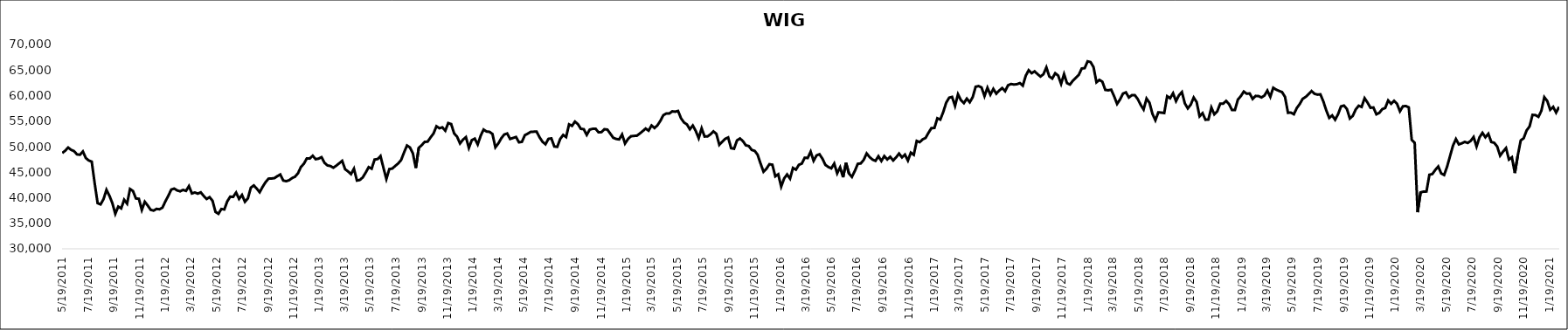
| Category | WIG |
|---|---|
| 5/19/11 | 48747.55 |
| 5/26/11 | 49215.53 |
| 6/2/11 | 49824.93 |
| 6/9/11 | 49378.82 |
| 6/16/11 | 49129.21 |
| 6/23/11 | 48485.26 |
| 6/30/11 | 48414.36 |
| 7/7/11 | 49057.05 |
| 7/14/11 | 47768.38 |
| 7/21/11 | 47291.31 |
| 7/28/11 | 47071.4 |
| 8/4/11 | 42828.22 |
| 8/11/11 | 38934.71 |
| 8/18/11 | 38697.56 |
| 8/25/11 | 39715.27 |
| 9/1/11 | 41553.09 |
| 9/8/11 | 40405.17 |
| 9/15/11 | 38945 |
| 9/22/11 | 36851.2 |
| 9/29/11 | 38264.32 |
| 10/6/11 | 37915.03 |
| 10/13/11 | 39608.13 |
| 10/20/11 | 38835.92 |
| 10/27/11 | 41708.88 |
| 11/3/11 | 41313.92 |
| 11/10/11 | 39853.18 |
| 11/17/11 | 39797.19 |
| 11/24/11 | 37607.27 |
| 12/1/11 | 39215.21 |
| 12/8/11 | 38474.28 |
| 12/15/11 | 37637.47 |
| 12/22/11 | 37478.7 |
| 12/29/11 | 37814.52 |
| 1/5/12 | 37739.39 |
| 1/12/12 | 38062.87 |
| 1/19/12 | 39288.13 |
| 1/26/12 | 40392.48 |
| 2/2/12 | 41602.24 |
| 2/9/12 | 41792.46 |
| 2/16/12 | 41430.3 |
| 2/23/12 | 41258.14 |
| 3/1/12 | 41533.87 |
| 3/8/12 | 41337.97 |
| 3/15/12 | 42281.33 |
| 3/22/12 | 40834.43 |
| 3/29/12 | 41028.06 |
| 4/5/12 | 40802.41 |
| 4/12/12 | 41053.82 |
| 4/19/12 | 40354.53 |
| 4/26/12 | 39761.78 |
| 5/3/12 | 40114.73 |
| 5/10/12 | 39404.16 |
| 5/17/12 | 37228.88 |
| 5/24/12 | 36852.75 |
| 5/31/12 | 37793.58 |
| 6/7/12 | 37707.25 |
| 6/14/12 | 39286.64 |
| 6/21/12 | 40207.61 |
| 6/28/12 | 40165.34 |
| 7/5/12 | 41013.96 |
| 7/12/12 | 39778.1 |
| 7/19/12 | 40545.64 |
| 7/26/12 | 39213.05 |
| 8/2/12 | 39876.95 |
| 8/9/12 | 41976.63 |
| 8/16/12 | 42408.41 |
| 8/23/12 | 41795.63 |
| 8/30/12 | 41077.44 |
| 9/6/12 | 42134.93 |
| 9/13/12 | 43047.41 |
| 9/20/12 | 43737.02 |
| 9/27/12 | 43763.3 |
| 10/4/12 | 43840.23 |
| 10/11/12 | 44224.67 |
| 10/18/12 | 44550.12 |
| 10/25/12 | 43374.6 |
| 11/1/12 | 43232.44 |
| 11/8/12 | 43429.42 |
| 11/15/12 | 43845.94 |
| 11/22/12 | 44121.53 |
| 11/29/12 | 44787.84 |
| 12/6/12 | 46019.97 |
| 12/13/12 | 46653.84 |
| 12/20/12 | 47701.82 |
| 12/27/12 | 47673.03 |
| 1/3/13 | 48222.72 |
| 1/10/13 | 47546.91 |
| 1/17/13 | 47661.37 |
| 1/24/13 | 47942.04 |
| 1/31/13 | 46840.15 |
| 2/7/13 | 46329.66 |
| 2/14/13 | 46211.54 |
| 2/21/13 | 45879.9 |
| 2/28/13 | 46280.36 |
| 3/7/13 | 46745.26 |
| 3/14/13 | 47223.68 |
| 3/21/13 | 45580.47 |
| 3/28/13 | 45147.57 |
| 4/4/13 | 44623.89 |
| 4/11/13 | 45688.48 |
| 4/18/13 | 43364.7 |
| 4/25/13 | 43482.18 |
| 5/2/13 | 43991.51 |
| 5/9/13 | 44943.16 |
| 5/16/13 | 45992.03 |
| 5/23/13 | 45687.76 |
| 5/30/13 | 47476.64 |
| 6/6/13 | 47573.66 |
| 6/13/13 | 48152.82 |
| 6/20/13 | 45870 |
| 6/27/13 | 43667.37 |
| 7/4/13 | 45613.75 |
| 7/11/13 | 45712.72 |
| 7/18/13 | 46221.23 |
| 7/25/13 | 46713.02 |
| 8/1/13 | 47370.81 |
| 8/8/13 | 48862.88 |
| 8/15/13 | 50223.95 |
| 8/22/13 | 49846.48 |
| 8/29/13 | 48676.45 |
| 9/5/13 | 45830.66 |
| 9/12/13 | 49771.55 |
| 9/19/13 | 50300.53 |
| 9/26/13 | 50936.34 |
| 10/3/13 | 50982.03 |
| 10/10/13 | 51806.83 |
| 10/17/13 | 52573.59 |
| 10/24/13 | 53994.46 |
| 10/31/13 | 53607.86 |
| 11/7/13 | 53785.07 |
| 11/14/13 | 53127.16 |
| 11/21/13 | 54621.21 |
| 11/28/13 | 54420.19 |
| 12/5/13 | 52597.13 |
| 12/12/13 | 51947.96 |
| 12/19/13 | 50631.75 |
| 12/26/13 | 51362.3 |
| 1/2/14 | 51865.89 |
| 1/9/14 | 49753.03 |
| 1/16/14 | 51288.7 |
| 1/23/14 | 51569.21 |
| 1/30/14 | 50417.17 |
| 2/6/14 | 52138.87 |
| 2/13/14 | 53349.65 |
| 2/20/14 | 52967.02 |
| 2/27/14 | 52906.04 |
| 3/6/14 | 52487.84 |
| 3/13/14 | 49878.65 |
| 3/20/14 | 50627.71 |
| 3/27/14 | 51642.99 |
| 4/3/14 | 52376.18 |
| 4/10/14 | 52580.73 |
| 4/17/14 | 51510.98 |
| 4/24/14 | 51705.76 |
| 5/1/14 | 51892.77 |
| 5/8/14 | 50851.25 |
| 5/15/14 | 50944.5 |
| 5/22/14 | 52244.13 |
| 5/29/14 | 52553.48 |
| 6/5/14 | 52901.29 |
| 6/12/14 | 52927.91 |
| 6/19/14 | 52937.45 |
| 6/26/14 | 51815.43 |
| 7/3/14 | 50951.73 |
| 7/10/14 | 50474.36 |
| 7/17/14 | 51527.37 |
| 7/24/14 | 51613.47 |
| 7/31/14 | 50037.12 |
| 8/7/14 | 49958.67 |
| 8/14/14 | 51512.57 |
| 8/21/14 | 52294.93 |
| 8/28/14 | 51882.01 |
| 9/4/14 | 54358.49 |
| 9/11/14 | 54065.27 |
| 9/18/14 | 54906.1 |
| 9/25/14 | 54411.77 |
| 10/2/14 | 53498.77 |
| 10/9/14 | 53416.03 |
| 10/16/14 | 52297.79 |
| 10/23/14 | 53335.43 |
| 10/30/14 | 53492 |
| 11/6/14 | 53512.14 |
| 11/13/14 | 52816.35 |
| 11/20/14 | 52848.54 |
| 11/27/14 | 53415.63 |
| 12/4/14 | 53346.86 |
| 12/11/14 | 52550.03 |
| 12/18/14 | 51739.04 |
| 12/25/14 | 51511.68 |
| 1/1/15 | 51416.08 |
| 1/8/15 | 52391 |
| 1/15/15 | 50616.63 |
| 1/22/15 | 51484.81 |
| 1/29/15 | 52040.24 |
| 2/5/15 | 52107.26 |
| 2/12/15 | 52139.81 |
| 2/19/15 | 52572.95 |
| 2/26/15 | 53042.6 |
| 3/5/15 | 53546.4 |
| 3/12/15 | 53136.13 |
| 3/19/15 | 54148.48 |
| 3/26/15 | 53649.9 |
| 4/2/15 | 54179.04 |
| 4/9/15 | 55063.85 |
| 4/16/15 | 56165.1 |
| 4/23/15 | 56492.95 |
| 4/30/15 | 56477.69 |
| 5/7/15 | 56911.34 |
| 5/14/15 | 56845.83 |
| 5/21/15 | 56990.6 |
| 5/28/15 | 55556.13 |
| 6/4/15 | 54749.74 |
| 6/11/15 | 54357.69 |
| 6/18/15 | 53408.53 |
| 6/25/15 | 54141.2 |
| 7/2/15 | 53074.71 |
| 7/9/15 | 51658.71 |
| 7/16/15 | 53588.24 |
| 7/23/15 | 51986.22 |
| 7/30/15 | 52011.81 |
| 8/6/15 | 52418.07 |
| 8/13/15 | 52995.96 |
| 8/20/15 | 52508.32 |
| 8/27/15 | 50366.09 |
| 9/3/15 | 50977.06 |
| 9/10/15 | 51527.08 |
| 9/17/15 | 51801.58 |
| 9/24/15 | 49701.31 |
| 10/1/15 | 49593.95 |
| 10/8/15 | 51222.77 |
| 10/15/15 | 51599.62 |
| 10/22/15 | 51094.29 |
| 10/29/15 | 50262.68 |
| 11/5/15 | 50125.85 |
| 11/12/15 | 49358.2 |
| 11/19/15 | 49177.74 |
| 11/26/15 | 48418.14 |
| 12/3/15 | 46693.09 |
| 12/10/15 | 45093.65 |
| 12/17/15 | 45684.05 |
| 12/24/15 | 46564.08 |
| 12/31/15 | 46467.38 |
| 1/7/16 | 44195.91 |
| 1/14/16 | 44596.08 |
| 1/21/16 | 42180.3 |
| 1/28/16 | 43778.96 |
| 2/4/16 | 44557.64 |
| 2/11/16 | 43741.96 |
| 2/18/16 | 45834.88 |
| 2/25/16 | 45497.77 |
| 3/3/16 | 46448.27 |
| 3/10/16 | 46686.74 |
| 3/17/16 | 47833.39 |
| 3/24/16 | 47778.01 |
| 3/31/16 | 49017.35 |
| 4/7/16 | 47231.36 |
| 4/14/16 | 48285.21 |
| 4/21/16 | 48514.39 |
| 4/28/16 | 47643.7 |
| 5/5/16 | 46430.16 |
| 5/12/16 | 46022.02 |
| 5/19/16 | 45751.68 |
| 5/26/16 | 46695.37 |
| 6/2/16 | 44772.72 |
| 6/9/16 | 45940.12 |
| 6/16/16 | 44007.81 |
| 6/23/16 | 46826.85 |
| 6/30/16 | 44748.53 |
| 7/7/16 | 44077.16 |
| 7/14/16 | 45246.26 |
| 7/21/16 | 46639.17 |
| 7/28/16 | 46718.98 |
| 8/4/16 | 47407.09 |
| 8/11/16 | 48675.96 |
| 8/18/16 | 47967.07 |
| 8/25/16 | 47464.07 |
| 9/1/16 | 47221.32 |
| 9/8/16 | 48129.15 |
| 9/15/16 | 47198.39 |
| 9/22/16 | 48154.88 |
| 9/29/16 | 47494.62 |
| 10/6/16 | 48014.44 |
| 10/13/16 | 47303.15 |
| 10/20/16 | 47894.17 |
| 10/27/16 | 48651.28 |
| 11/3/16 | 47899.61 |
| 11/10/16 | 48447.59 |
| 11/17/16 | 47274.21 |
| 11/24/16 | 48824.83 |
| 12/1/16 | 48404.21 |
| 12/8/16 | 51123.43 |
| 12/15/16 | 50881.35 |
| 12/22/16 | 51423.71 |
| 12/29/16 | 51703.91 |
| 1/5/17 | 52721.67 |
| 1/12/17 | 53650.94 |
| 1/19/17 | 53654.99 |
| 1/26/17 | 55560.23 |
| 2/2/17 | 55303.11 |
| 2/9/17 | 56785.52 |
| 2/16/17 | 58610.28 |
| 2/23/17 | 59583.89 |
| 3/2/17 | 59743.64 |
| 3/9/17 | 57986.6 |
| 3/16/17 | 60247.18 |
| 3/23/17 | 59093.68 |
| 3/30/17 | 58527.2 |
| 4/6/17 | 59406.36 |
| 4/13/17 | 58695.36 |
| 4/20/17 | 59700.07 |
| 4/27/17 | 61731.8 |
| 5/4/17 | 61862.8 |
| 5/11/17 | 61598.78 |
| 5/18/17 | 59901.12 |
| 5/25/17 | 61536.22 |
| 6/1/17 | 60181.96 |
| 6/8/17 | 61312.68 |
| 6/15/17 | 60381.07 |
| 6/22/17 | 60987.33 |
| 6/29/17 | 61475.96 |
| 7/6/17 | 60869.83 |
| 7/13/17 | 62018.68 |
| 7/20/17 | 62269.72 |
| 7/27/17 | 62171.7 |
| 8/3/17 | 62231.08 |
| 8/10/17 | 62451.57 |
| 8/17/17 | 61949.4 |
| 8/24/17 | 63886.54 |
| 8/31/17 | 64973.76 |
| 9/7/17 | 64381.87 |
| 9/14/17 | 64748.47 |
| 9/21/17 | 64209.19 |
| 9/28/17 | 63729.77 |
| 10/5/17 | 64185.71 |
| 10/12/17 | 65529.1 |
| 10/19/17 | 63745 |
| 10/26/17 | 63342.71 |
| 11/2/17 | 64375.83 |
| 11/9/17 | 63923.62 |
| 11/16/17 | 62299.29 |
| 11/23/17 | 64207.77 |
| 11/30/17 | 62440.31 |
| 12/7/17 | 62164.65 |
| 12/14/17 | 62916.39 |
| 12/21/17 | 63477.25 |
| 12/28/17 | 64053.47 |
| 1/4/18 | 65297.96 |
| 1/11/18 | 65379.88 |
| 1/18/18 | 66709.12 |
| 1/25/18 | 66561.79 |
| 2/1/18 | 65585.79 |
| 2/8/18 | 62604.89 |
| 2/15/18 | 63078.16 |
| 2/22/18 | 62717.27 |
| 3/1/18 | 61116.96 |
| 3/8/18 | 61036.99 |
| 3/15/18 | 61156.91 |
| 3/22/18 | 59862.55 |
| 3/29/18 | 58377.42 |
| 4/5/18 | 59244.04 |
| 4/12/18 | 60393.23 |
| 4/19/18 | 60629.81 |
| 4/26/18 | 59628.04 |
| 5/3/18 | 60066.46 |
| 5/10/18 | 60091.26 |
| 5/17/18 | 59337.27 |
| 5/24/18 | 58189.49 |
| 5/31/18 | 57282.73 |
| 6/7/18 | 59412.76 |
| 6/14/18 | 58603.93 |
| 6/21/18 | 56425.25 |
| 6/28/18 | 55169.77 |
| 7/5/18 | 56719.88 |
| 7/12/18 | 56671.44 |
| 7/19/18 | 56585.5 |
| 7/26/18 | 59871.2 |
| 8/2/18 | 59484.35 |
| 8/9/18 | 60455.75 |
| 8/16/18 | 58921.44 |
| 8/23/18 | 60044.45 |
| 8/30/18 | 60690.32 |
| 9/6/18 | 58469.6 |
| 9/13/18 | 57493.38 |
| 9/20/18 | 58231.57 |
| 9/27/18 | 59616.27 |
| 10/4/18 | 58736.08 |
| 10/11/18 | 55941.06 |
| 10/18/18 | 56560.93 |
| 10/25/18 | 55271.63 |
| 11/1/18 | 55312.71 |
| 11/8/18 | 57655.73 |
| 11/15/18 | 56329.01 |
| 11/22/18 | 56932.62 |
| 11/29/18 | 58412.94 |
| 12/6/18 | 58409.09 |
| 12/13/18 | 58952.55 |
| 12/20/18 | 58349.03 |
| 12/27/18 | 57183.28 |
| 1/3/19 | 57192.42 |
| 1/10/19 | 59219.23 |
| 1/17/19 | 59894.9 |
| 1/24/19 | 60791.02 |
| 1/31/19 | 60367.42 |
| 2/7/19 | 60422.38 |
| 2/14/19 | 59348.4 |
| 2/21/19 | 59938.07 |
| 2/28/19 | 59903.7 |
| 3/7/19 | 59638.3 |
| 3/14/19 | 60002.72 |
| 3/21/19 | 60976.51 |
| 3/28/19 | 59752.66 |
| 4/4/19 | 61533.27 |
| 4/11/19 | 61168.92 |
| 4/18/19 | 60910.11 |
| 4/25/19 | 60680.62 |
| 5/2/19 | 59744.3 |
| 5/9/19 | 56637.25 |
| 5/16/19 | 56664.5 |
| 5/23/19 | 56351.13 |
| 5/30/19 | 57566.83 |
| 6/6/19 | 58360.5 |
| 6/13/19 | 59374.38 |
| 6/20/19 | 59738.56 |
| 6/27/19 | 60293.37 |
| 7/4/19 | 60888.98 |
| 7/11/19 | 60362.11 |
| 7/18/19 | 60192.6 |
| 7/25/19 | 60249.72 |
| 8/1/19 | 58863.73 |
| 8/8/19 | 57102.69 |
| 8/15/19 | 55634.7 |
| 8/22/19 | 56118.92 |
| 8/29/19 | 55273.05 |
| 9/5/19 | 56358.3 |
| 9/12/19 | 57886.6 |
| 9/19/19 | 58053.03 |
| 9/26/19 | 57377.87 |
| 10/3/19 | 55523.06 |
| 10/10/19 | 56034.97 |
| 10/17/19 | 57297.12 |
| 10/24/19 | 58012.97 |
| 10/31/19 | 57783.02 |
| 11/7/19 | 59492.22 |
| 11/14/19 | 58622.1 |
| 11/21/19 | 57618.54 |
| 11/28/19 | 57669.94 |
| 12/5/19 | 56338.75 |
| 12/12/19 | 56621.06 |
| 12/19/19 | 57346.95 |
| 12/26/19 | 57569.71 |
| 1/2/20 | 59048.28 |
| 1/9/20 | 58397.17 |
| 1/16/20 | 58962.37 |
| 1/23/20 | 58401.85 |
| 1/30/20 | 56923.36 |
| 2/6/20 | 57900.04 |
| 2/13/20 | 57960.23 |
| 2/20/20 | 57693.12 |
| 2/27/20 | 51318.69 |
| 3/5/20 | 50753.91 |
| 3/12/20 | 37164.02 |
| 3/19/20 | 41041.92 |
| 3/26/20 | 41202.98 |
| 4/2/20 | 41219.51 |
| 4/9/20 | 44499.23 |
| 4/16/20 | 44645.12 |
| 4/23/20 | 45450.43 |
| 4/30/20 | 46117 |
| 5/7/20 | 44769.05 |
| 5/14/20 | 44450.71 |
| 5/21/20 | 46073.39 |
| 5/28/20 | 48144.34 |
| 6/4/20 | 50202.54 |
| 6/11/20 | 51486.94 |
| 6/18/20 | 50445.13 |
| 6/25/20 | 50658.89 |
| 7/2/20 | 50937.18 |
| 7/9/20 | 50726.22 |
| 7/16/20 | 51121.23 |
| 7/23/20 | 51890.42 |
| 7/30/20 | 50024.63 |
| 8/6/20 | 51816.87 |
| 8/13/20 | 52706.25 |
| 8/20/20 | 51842.65 |
| 8/27/20 | 52528.67 |
| 9/3/20 | 50915.67 |
| 9/10/20 | 50757.07 |
| 9/17/20 | 50035.54 |
| 9/24/20 | 48241.11 |
| 10/1/20 | 49035.41 |
| 10/8/20 | 49727.34 |
| 10/15/20 | 47482 |
| 10/22/20 | 47910.38 |
| 10/29/20 | 44840.6 |
| 11/5/20 | 48295.31 |
| 11/12/20 | 51229.23 |
| 11/19/20 | 51651.4 |
| 11/26/20 | 53187.31 |
| 12/3/20 | 53967.82 |
| 12/10/20 | 56230.4 |
| 12/17/20 | 56176.07 |
| 12/24/20 | 55843.46 |
| 12/31/20 | 57025 |
| 1/7/21 | 59687 |
| 1/14/21 | 58945.17 |
| 1/21/21 | 57226 |
| 1/28/21 | 57797 |
| 2/4/21 | 56669.86 |
| 2/11/21 | 57790 |